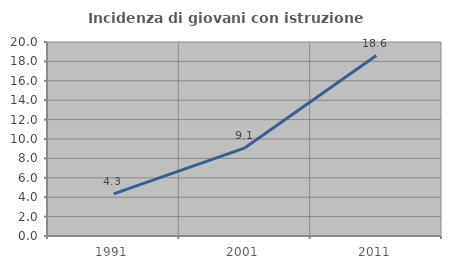
| Category | Incidenza di giovani con istruzione universitaria |
|---|---|
| 1991.0 | 4.348 |
| 2001.0 | 9.091 |
| 2011.0 | 18.605 |